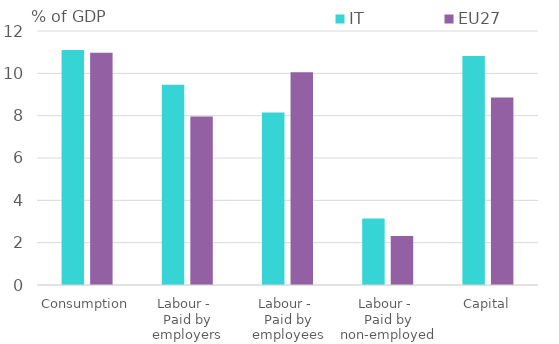
| Category | IT | EU27 |
|---|---|---|
| Consumption | 11.108 | 10.967 |
| Labour - 
Paid by employers | 9.463 | 7.966 |
| Labour - 
Paid by employees | 8.146 | 10.052 |
| Labour - 
Paid by non-employed | 3.139 | 2.311 |
| Capital | 10.816 | 8.858 |